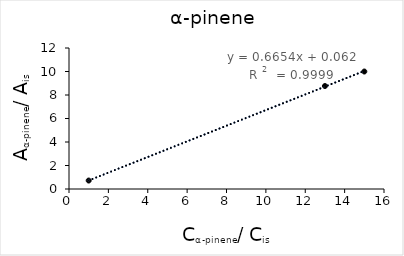
| Category | Series 0 |
|---|---|
| 1.0 | 0.72 |
| 13.0 | 8.764 |
| 15.0 | 9.998 |